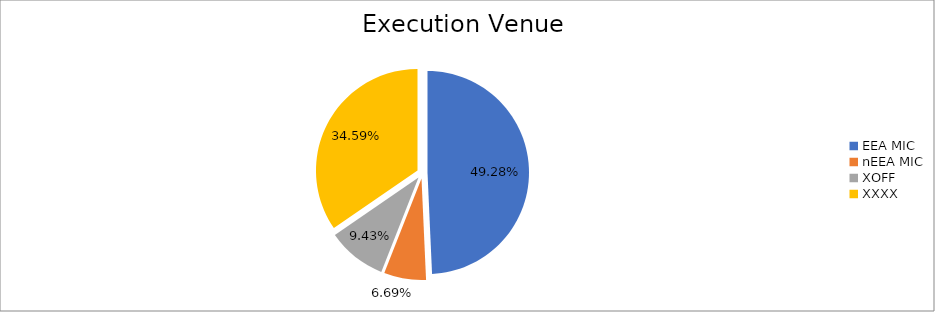
| Category | Series 0 |
|---|---|
| EEA MIC | 6228018.819 |
| nEEA MIC | 845698.73 |
| XOFF | 1192210.523 |
| XXXX | 4371361.716 |